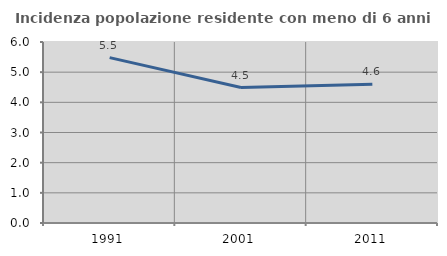
| Category | Incidenza popolazione residente con meno di 6 anni |
|---|---|
| 1991.0 | 5.481 |
| 2001.0 | 4.491 |
| 2011.0 | 4.603 |